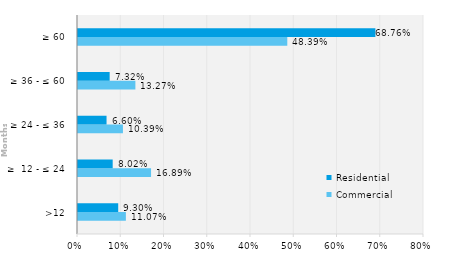
| Category | Commercial | Residential |
|---|---|---|
| >12 | 0.111 | 0.093 |
| ≥  12 - ≤ 24 | 0.169 | 0.08 |
| ≥ 24 - ≤ 36 | 0.104 | 0.066 |
| ≥ 36 - ≤ 60 | 0.133 | 0.073 |
| ≥ 60 | 0.484 | 0.688 |